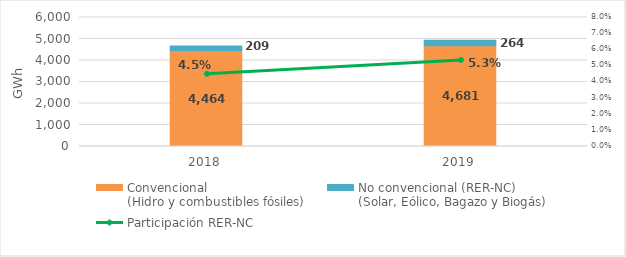
| Category | Convencional
(Hidro y combustibles fósiles) | No convencional (RER-NC)
(Solar, Eólico, Bagazo y Biogás) |
|---|---|---|
| 2018.0 | 4464.451 | 209.272 |
| 2019.0 | 4680.795 | 263.787 |